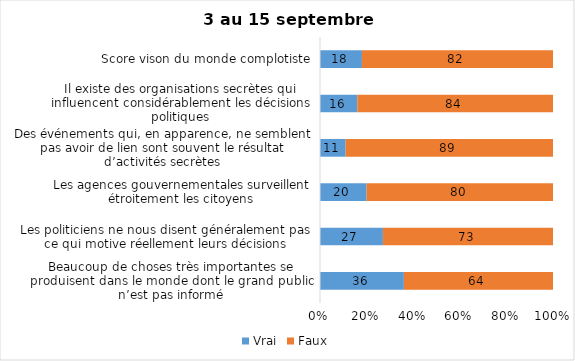
| Category | Vrai | Faux |
|---|---|---|
| Beaucoup de choses très importantes se produisent dans le monde dont le grand public n’est pas informé | 36 | 64 |
| Les politiciens ne nous disent généralement pas ce qui motive réellement leurs décisions | 27 | 73 |
| Les agences gouvernementales surveillent étroitement les citoyens | 20 | 80 |
| Des événements qui, en apparence, ne semblent pas avoir de lien sont souvent le résultat d’activités secrètes | 11 | 89 |
| Il existe des organisations secrètes qui influencent considérablement les décisions politiques | 16 | 84 |
| Score vison du monde complotiste | 18 | 82 |